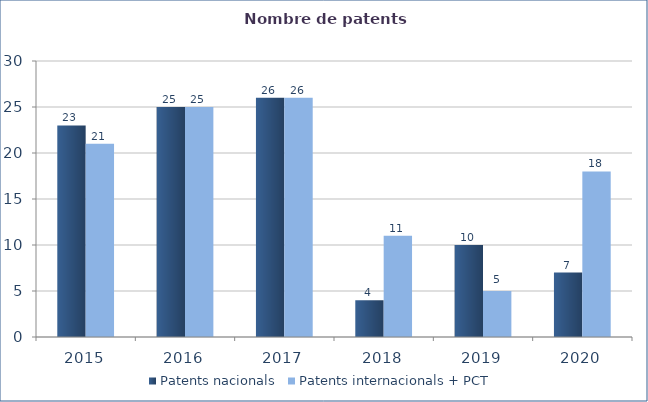
| Category | Patents nacionals | Patents internacionals + PCT |
|---|---|---|
| 2015.0 | 23 | 21 |
| 2016.0 | 25 | 25 |
| 2017.0 | 26 | 26 |
| 2018.0 | 4 | 11 |
| 2019.0 | 10 | 5 |
| 2020.0 | 7 | 18 |